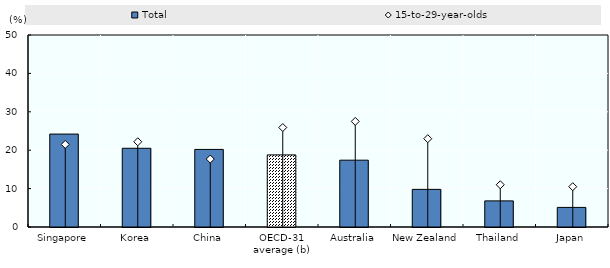
| Category | Total |
|---|---|
| 0 | 24.2 |
| 1 | 20.5 |
| 2 | 20.2 |
| 3 | 18.776 |
| 4 | 17.4 |
| 5 | 9.8 |
| 6 | 6.8 |
| 7 | 5.1 |